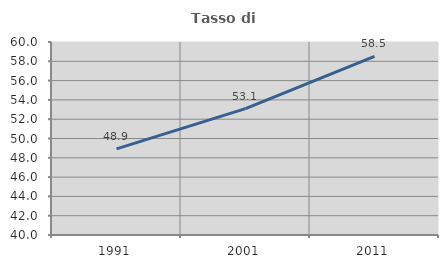
| Category | Tasso di occupazione   |
|---|---|
| 1991.0 | 48.921 |
| 2001.0 | 53.097 |
| 2011.0 | 58.512 |